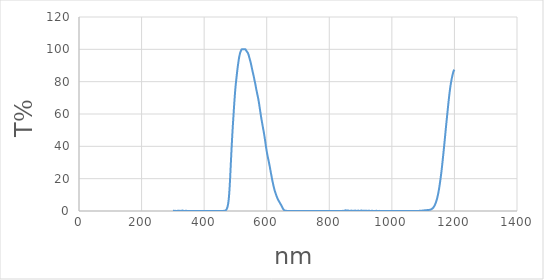
| Category | Series 0 |
|---|---|
| 1200.0 | 87.41 |
| 1199.0 | 87.18 |
| 1198.0 | 86.83 |
| 1197.0 | 86.35 |
| 1196.0 | 85.72 |
| 1195.0 | 84.98 |
| 1194.0 | 84.19 |
| 1193.0 | 83.32 |
| 1192.0 | 82.41 |
| 1191.0 | 81.44 |
| 1190.0 | 80.4 |
| 1189.0 | 79.31 |
| 1188.0 | 78.11 |
| 1187.0 | 76.83 |
| 1186.0 | 75.48 |
| 1185.0 | 73.97 |
| 1184.0 | 72.39 |
| 1183.0 | 70.72 |
| 1182.0 | 68.98 |
| 1181.0 | 67.16 |
| 1180.0 | 65.33 |
| 1179.0 | 63.46 |
| 1178.0 | 61.56 |
| 1177.0 | 59.67 |
| 1176.0 | 57.73 |
| 1175.0 | 55.84 |
| 1174.0 | 53.9 |
| 1173.0 | 51.95 |
| 1172.0 | 49.97 |
| 1171.0 | 47.94 |
| 1170.0 | 45.94 |
| 1169.0 | 43.89 |
| 1168.0 | 41.92 |
| 1167.0 | 39.94 |
| 1166.0 | 38 |
| 1165.0 | 36.1 |
| 1164.0 | 34.22 |
| 1163.0 | 32.36 |
| 1162.0 | 30.5 |
| 1161.0 | 28.7 |
| 1160.0 | 26.91 |
| 1159.0 | 25.21 |
| 1158.0 | 23.57 |
| 1157.0 | 22.03 |
| 1156.0 | 20.56 |
| 1155.0 | 19.11 |
| 1154.0 | 17.75 |
| 1153.0 | 16.43 |
| 1152.0 | 15.14 |
| 1151.0 | 13.91 |
| 1150.0 | 12.77 |
| 1149.0 | 11.68 |
| 1148.0 | 10.68 |
| 1147.0 | 9.76 |
| 1146.0 | 8.9 |
| 1145.0 | 8.07 |
| 1144.0 | 7.33 |
| 1143.0 | 6.65 |
| 1142.0 | 6.02 |
| 1141.0 | 5.43 |
| 1140.0 | 4.9 |
| 1139.0 | 4.42 |
| 1138.0 | 3.97 |
| 1137.0 | 3.56 |
| 1136.0 | 3.19 |
| 1135.0 | 2.84 |
| 1134.0 | 2.53 |
| 1133.0 | 2.25 |
| 1132.0 | 2.01 |
| 1131.0 | 1.79 |
| 1130.0 | 1.62 |
| 1129.0 | 1.46 |
| 1128.0 | 1.32 |
| 1127.0 | 1.2 |
| 1126.0 | 1.09 |
| 1125.0 | 1 |
| 1124.0 | 0.92 |
| 1123.0 | 0.86 |
| 1122.0 | 0.81 |
| 1121.0 | 0.75 |
| 1120.0 | 0.71 |
| 1119.0 | 0.68 |
| 1118.0 | 0.65 |
| 1117.0 | 0.63 |
| 1116.0 | 0.61 |
| 1115.0 | 0.61 |
| 1114.0 | 0.58 |
| 1113.0 | 0.56 |
| 1112.0 | 0.54 |
| 1111.0 | 0.52 |
| 1110.0 | 0.5 |
| 1109.0 | 0.5 |
| 1108.0 | 0.49 |
| 1107.0 | 0.46 |
| 1106.0 | 0.44 |
| 1105.0 | 0.42 |
| 1104.0 | 0.4 |
| 1103.0 | 0.37 |
| 1102.0 | 0.34 |
| 1101.0 | 0.33 |
| 1100.0 | 0.3 |
| 1099.0 | 0.27 |
| 1098.0 | 0.25 |
| 1097.0 | 0.23 |
| 1096.0 | 0.21 |
| 1095.0 | 0.21 |
| 1094.0 | 0.21 |
| 1093.0 | 0.19 |
| 1092.0 | 0.18 |
| 1091.0 | 0.17 |
| 1090.0 | 0.14 |
| 1089.0 | 0.11 |
| 1088.0 | 0.09 |
| 1087.0 | 0.07 |
| 1086.0 | 0.06 |
| 1085.0 | 0.05 |
| 1084.0 | 0.06 |
| 1083.0 | 0.07 |
| 1082.0 | 0.07 |
| 1081.0 | 0.06 |
| 1080.0 | 0.06 |
| 1079.0 | 0.05 |
| 1078.0 | 0.06 |
| 1077.0 | 0.05 |
| 1076.0 | 0.04 |
| 1075.0 | 0.03 |
| 1074.0 | 0.02 |
| 1073.0 | 0.02 |
| 1072.0 | 0.02 |
| 1071.0 | 0.02 |
| 1070.0 | 0.02 |
| 1069.0 | 0.02 |
| 1068.0 | 0.03 |
| 1067.0 | 0.03 |
| 1066.0 | 0.02 |
| 1065.0 | 0.01 |
| 1064.0 | 0.01 |
| 1063.0 | 0.03 |
| 1062.0 | 0.02 |
| 1061.0 | 0.02 |
| 1060.0 | 0.02 |
| 1059.0 | 0.03 |
| 1058.0 | 0.04 |
| 1057.0 | 0.05 |
| 1056.0 | 0.04 |
| 1055.0 | 0.04 |
| 1054.0 | 0.05 |
| 1053.0 | 0.05 |
| 1052.0 | 0.03 |
| 1051.0 | 0.03 |
| 1050.0 | 0.02 |
| 1049.0 | 0.02 |
| 1048.0 | 0.02 |
| 1047.0 | 0.02 |
| 1046.0 | 0.02 |
| 1045.0 | 0.03 |
| 1044.0 | 0.04 |
| 1043.0 | 0.05 |
| 1042.0 | 0.06 |
| 1041.0 | 0.06 |
| 1040.0 | 0.05 |
| 1039.0 | 0.03 |
| 1038.0 | 0.02 |
| 1037.0 | 0 |
| 1036.0 | 0.01 |
| 1035.0 | 0.02 |
| 1034.0 | 0 |
| 1033.0 | 0.04 |
| 1032.0 | 0.06 |
| 1031.0 | 0.06 |
| 1030.0 | 0.06 |
| 1029.0 | 0.03 |
| 1028.0 | 0.01 |
| 1027.0 | 0 |
| 1026.0 | 0.02 |
| 1025.0 | 0 |
| 1024.0 | 0.02 |
| 1023.0 | 0.05 |
| 1022.0 | 0.07 |
| 1021.0 | 0.06 |
| 1020.0 | 0.05 |
| 1019.0 | 0.03 |
| 1018.0 | 0.03 |
| 1017.0 | 0.01 |
| 1016.0 | 0.02 |
| 1015.0 | 0.02 |
| 1014.0 | 0.02 |
| 1013.0 | 0.04 |
| 1012.0 | 0.03 |
| 1011.0 | 0.04 |
| 1010.0 | 0 |
| 1009.0 | 0 |
| 1008.0 | 0.01 |
| 1007.0 | 0.01 |
| 1006.0 | 0.01 |
| 1005.0 | 0.01 |
| 1004.0 | 0.02 |
| 1003.0 | 0.01 |
| 1002.0 | 0 |
| 1001.0 | 0.01 |
| 1000.0 | 0 |
| 999.0 | 0.01 |
| 998.0 | 0.01 |
| 997.0 | 0.03 |
| 996.0 | 0.01 |
| 995.0 | 0.02 |
| 994.0 | 0.02 |
| 993.0 | 0 |
| 992.0 | 0.01 |
| 991.0 | 0.01 |
| 990.0 | 0.02 |
| 989.0 | 0.05 |
| 988.0 | 0.06 |
| 987.0 | 0.04 |
| 986.0 | 0 |
| 985.0 | 0 |
| 984.0 | 0.01 |
| 983.0 | 0.01 |
| 982.0 | 0.03 |
| 981.0 | 0.02 |
| 980.0 | 0.04 |
| 979.0 | 0.07 |
| 978.0 | 0.02 |
| 977.0 | 0.02 |
| 976.0 | 0.01 |
| 975.0 | 0.03 |
| 974.0 | 0.02 |
| 973.0 | 0 |
| 972.0 | 0.01 |
| 971.0 | 0.03 |
| 970.0 | 0.04 |
| 969.0 | 0.02 |
| 968.0 | 0.02 |
| 967.0 | 0.03 |
| 966.0 | 0.01 |
| 965.0 | 0.02 |
| 964.0 | 0.02 |
| 963.0 | 0.02 |
| 962.0 | 0.04 |
| 961.0 | 0.04 |
| 960.0 | 0.05 |
| 959.0 | 0.08 |
| 958.0 | 0.05 |
| 957.0 | 0.03 |
| 956.0 | 0.04 |
| 955.0 | 0.05 |
| 954.0 | 0.06 |
| 953.0 | 0.04 |
| 952.0 | 0.07 |
| 951.0 | 0.11 |
| 950.0 | 0.12 |
| 949.0 | 0.06 |
| 948.0 | 0.04 |
| 947.0 | 0.03 |
| 946.0 | 0.04 |
| 945.0 | 0.04 |
| 944.0 | 0 |
| 943.0 | 0.02 |
| 942.0 | 0.02 |
| 941.0 | 0.01 |
| 940.0 | 0.03 |
| 939.0 | 0.06 |
| 938.0 | 0.12 |
| 937.0 | 0.15 |
| 936.0 | 0.16 |
| 935.0 | 0.08 |
| 934.0 | 0.02 |
| 933.0 | 0.03 |
| 932.0 | 0.04 |
| 931.0 | 0.02 |
| 930.0 | 0.05 |
| 929.0 | 0.13 |
| 928.0 | 0.17 |
| 927.0 | 0.21 |
| 926.0 | 0.23 |
| 925.0 | 0.21 |
| 924.0 | 0.15 |
| 923.0 | 0.07 |
| 922.0 | 0.03 |
| 921.0 | 0.03 |
| 920.0 | 0.06 |
| 919.0 | 0.12 |
| 918.0 | 0.16 |
| 917.0 | 0.17 |
| 916.0 | 0.16 |
| 915.0 | 0.16 |
| 914.0 | 0.18 |
| 913.0 | 0.18 |
| 912.0 | 0.16 |
| 911.0 | 0.16 |
| 910.0 | 0.17 |
| 909.0 | 0.13 |
| 908.0 | 0.08 |
| 907.0 | 0.01 |
| 906.0 | 0.12 |
| 905.0 | 0.2 |
| 904.0 | 0.27 |
| 903.0 | 0.29 |
| 902.0 | 0.3 |
| 901.0 | 0.23 |
| 900.0 | 0.18 |
| 899.0 | 0.09 |
| 898.0 | 0.01 |
| 897.0 | 0.03 |
| 896.0 | 0 |
| 895.0 | 0.06 |
| 894.0 | 0.16 |
| 893.0 | 0.24 |
| 892.0 | 0.23 |
| 891.0 | 0.06 |
| 890.0 | 0.06 |
| 889.0 | 0.11 |
| 888.0 | 0.03 |
| 887.0 | 0.01 |
| 886.0 | 0.08 |
| 885.0 | 0.14 |
| 884.0 | 0.2 |
| 883.0 | 0.27 |
| 882.0 | 0.19 |
| 881.0 | 0.04 |
| 880.0 | 0.06 |
| 879.0 | 0.16 |
| 878.0 | 0.17 |
| 877.0 | 0.03 |
| 876.0 | 0.03 |
| 875.0 | 0.06 |
| 874.0 | 0.11 |
| 873.0 | 0.07 |
| 872.0 | 0.07 |
| 871.0 | 0.21 |
| 870.0 | 0.28 |
| 869.0 | 0.21 |
| 868.0 | 0.09 |
| 867.0 | 0 |
| 866.0 | 0.06 |
| 865.0 | 0.09 |
| 864.0 | 0.04 |
| 863.0 | 0.04 |
| 862.0 | 0.02 |
| 861.0 | 0.23 |
| 860.0 | 0.37 |
| 859.0 | 0.31 |
| 858.0 | 0.12 |
| 857.0 | 0.33 |
| 856.0 | 0.3 |
| 855.0 | 0.22 |
| 854.0 | 0.26 |
| 853.0 | 0.39 |
| 852.0 | 0.42 |
| 851.0 | 0.33 |
| 850.0 | 0.28 |
| 849.0 | 0.22 |
| 848.0 | 0.1 |
| 847.0 | 0.01 |
| 846.0 | 0.02 |
| 845.0 | 0.03 |
| 844.0 | 0.14 |
| 843.0 | 0.02 |
| 842.0 | 0.04 |
| 841.0 | 0.03 |
| 840.0 | 0.02 |
| 839.0 | 0.01 |
| 838.0 | 0.01 |
| 837.0 | 0.01 |
| 836.0 | 0.01 |
| 835.0 | 0 |
| 834.0 | 0 |
| 833.0 | 0 |
| 832.0 | 0 |
| 831.0 | 0 |
| 830.0 | 0 |
| 829.0 | 0 |
| 828.0 | 0 |
| 827.0 | 0 |
| 826.0 | 0 |
| 825.0 | 0 |
| 824.0 | 0.01 |
| 823.0 | 0.01 |
| 822.0 | 0.01 |
| 821.0 | 0.01 |
| 820.0 | 0.01 |
| 819.0 | 0.01 |
| 818.0 | 0.01 |
| 817.0 | 0.01 |
| 816.0 | 0.01 |
| 815.0 | 0.01 |
| 814.0 | 0.02 |
| 813.0 | 0.01 |
| 812.0 | 0.01 |
| 811.0 | 0.01 |
| 810.0 | 0.01 |
| 809.0 | 0.01 |
| 808.0 | 0.02 |
| 807.0 | 0.02 |
| 806.0 | 0.02 |
| 805.0 | 0.02 |
| 804.0 | 0.02 |
| 803.0 | 0.02 |
| 802.0 | 0.02 |
| 801.0 | 0.02 |
| 800.0 | 0.02 |
| 799.0 | 0.02 |
| 798.0 | 0.02 |
| 797.0 | 0.02 |
| 796.0 | 0.02 |
| 795.0 | 0.01 |
| 794.0 | 0.01 |
| 793.0 | 0.02 |
| 792.0 | 0.01 |
| 791.0 | 0.01 |
| 790.0 | 0.01 |
| 789.0 | 0.01 |
| 788.0 | 0.01 |
| 787.0 | 0.01 |
| 786.0 | 0 |
| 785.0 | 0 |
| 784.0 | 0 |
| 783.0 | 0 |
| 782.0 | 0 |
| 781.0 | 0 |
| 780.0 | 0 |
| 779.0 | 0.01 |
| 778.0 | 0.01 |
| 777.0 | 0.01 |
| 776.0 | 0.01 |
| 775.0 | 0.01 |
| 774.0 | 0.01 |
| 773.0 | 0.01 |
| 772.0 | 0 |
| 771.0 | 0.01 |
| 770.0 | 0.01 |
| 769.0 | 0.01 |
| 768.0 | 0.01 |
| 767.0 | 0.01 |
| 766.0 | 0.01 |
| 765.0 | 0.01 |
| 764.0 | 0.01 |
| 763.0 | 0 |
| 762.0 | 0 |
| 761.0 | 0.01 |
| 760.0 | 0.01 |
| 759.0 | 0.01 |
| 758.0 | 0.01 |
| 757.0 | 0.01 |
| 756.0 | 0.01 |
| 755.0 | 0.01 |
| 754.0 | 0.01 |
| 753.0 | 0.01 |
| 752.0 | 0.01 |
| 751.0 | 0.01 |
| 750.0 | 0.01 |
| 749.0 | 0.01 |
| 748.0 | 0 |
| 747.0 | 0 |
| 746.0 | 0.01 |
| 745.0 | 0.01 |
| 744.0 | 0.01 |
| 743.0 | 0.01 |
| 742.0 | 0.01 |
| 741.0 | 0.01 |
| 740.0 | 0.01 |
| 739.0 | 0.02 |
| 738.0 | 0.02 |
| 737.0 | 0.02 |
| 736.0 | 0.02 |
| 735.0 | 0.02 |
| 734.0 | 0.01 |
| 733.0 | 0.01 |
| 732.0 | 0.01 |
| 731.0 | 0.01 |
| 730.0 | 0.01 |
| 729.0 | 0.01 |
| 728.0 | 0.01 |
| 727.0 | 0.01 |
| 726.0 | 0.01 |
| 725.0 | 0.01 |
| 724.0 | 0.01 |
| 723.0 | 0.01 |
| 722.0 | 0.01 |
| 721.0 | 0.01 |
| 720.0 | 0.01 |
| 719.0 | 0.01 |
| 718.0 | 0.01 |
| 717.0 | 0.01 |
| 716.0 | 0.01 |
| 715.0 | 0.01 |
| 714.0 | 0.01 |
| 713.0 | 0.01 |
| 712.0 | 0.01 |
| 711.0 | 0.01 |
| 710.0 | 0.01 |
| 709.0 | 0.01 |
| 708.0 | 0.01 |
| 707.0 | 0.01 |
| 706.0 | 0.01 |
| 705.0 | 0.01 |
| 704.0 | 0.01 |
| 703.0 | 0.01 |
| 702.0 | 0.01 |
| 701.0 | 0.01 |
| 700.0 | 0.01 |
| 699.0 | 0.01 |
| 698.0 | 0.01 |
| 697.0 | 0.01 |
| 696.0 | 0.01 |
| 695.0 | 0.01 |
| 694.0 | 0.01 |
| 693.0 | 0.01 |
| 692.0 | 0.01 |
| 691.0 | 0.01 |
| 690.0 | 0.01 |
| 689.0 | 0.01 |
| 688.0 | 0.01 |
| 687.0 | 0.01 |
| 686.0 | 0.01 |
| 685.0 | 0.01 |
| 684.0 | 0.01 |
| 683.0 | 0.01 |
| 682.0 | 0.01 |
| 681.0 | 0.01 |
| 680.0 | 0.01 |
| 679.0 | 0.01 |
| 678.0 | 0.01 |
| 677.0 | 0 |
| 676.0 | 0 |
| 675.0 | 0 |
| 674.0 | 0 |
| 673.0 | 0 |
| 672.0 | 0.01 |
| 671.0 | 0.01 |
| 670.0 | 0.02 |
| 669.0 | 0.02 |
| 668.0 | 0.03 |
| 667.0 | 0.04 |
| 666.0 | 0.05 |
| 665.0 | 0.07 |
| 664.0 | 0.08 |
| 663.0 | 0.1 |
| 662.0 | 0.12 |
| 661.0 | 0.15 |
| 660.0 | 0.18 |
| 659.0 | 0.23 |
| 658.0 | 0.29 |
| 657.0 | 0.39 |
| 656.0 | 0.52 |
| 655.0 | 0.69 |
| 654.0 | 0.9 |
| 653.0 | 1.15 |
| 652.0 | 1.45 |
| 651.0 | 1.79 |
| 650.0 | 2.15 |
| 649.0 | 2.53 |
| 648.0 | 2.91 |
| 647.0 | 3.29 |
| 646.0 | 3.68 |
| 645.0 | 4.04 |
| 644.0 | 4.39 |
| 643.0 | 4.74 |
| 642.0 | 5.08 |
| 641.0 | 5.4 |
| 640.0 | 5.73 |
| 639.0 | 6.07 |
| 638.0 | 6.4 |
| 637.0 | 6.75 |
| 636.0 | 7.14 |
| 635.0 | 7.56 |
| 634.0 | 7.99 |
| 633.0 | 8.45 |
| 632.0 | 8.97 |
| 631.0 | 9.49 |
| 630.0 | 10.04 |
| 629.0 | 10.57 |
| 628.0 | 11.13 |
| 627.0 | 11.72 |
| 626.0 | 12.34 |
| 625.0 | 13.01 |
| 624.0 | 13.73 |
| 623.0 | 14.47 |
| 622.0 | 15.3 |
| 621.0 | 16.16 |
| 620.0 | 17.07 |
| 619.0 | 17.98 |
| 618.0 | 18.93 |
| 617.0 | 19.9 |
| 616.0 | 20.91 |
| 615.0 | 21.92 |
| 614.0 | 22.93 |
| 613.0 | 23.98 |
| 612.0 | 25.08 |
| 611.0 | 26.15 |
| 610.0 | 27.2 |
| 609.0 | 28.2 |
| 608.0 | 29.17 |
| 607.0 | 30.11 |
| 606.0 | 31.11 |
| 605.0 | 32 |
| 604.0 | 32.91 |
| 603.0 | 33.8 |
| 602.0 | 34.79 |
| 601.0 | 35.85 |
| 600.0 | 36.94 |
| 599.0 | 38.09 |
| 598.0 | 39.35 |
| 597.0 | 40.68 |
| 596.0 | 42.04 |
| 595.0 | 43.44 |
| 594.0 | 44.73 |
| 593.0 | 45.96 |
| 592.0 | 47.16 |
| 591.0 | 48.36 |
| 590.0 | 49.5 |
| 589.0 | 50.5 |
| 588.0 | 51.57 |
| 587.0 | 52.66 |
| 586.0 | 53.76 |
| 585.0 | 54.87 |
| 584.0 | 55.96 |
| 583.0 | 57.11 |
| 582.0 | 58.28 |
| 581.0 | 59.49 |
| 580.0 | 60.79 |
| 579.0 | 62.11 |
| 578.0 | 63.33 |
| 577.0 | 64.63 |
| 576.0 | 65.93 |
| 575.0 | 67.09 |
| 574.0 | 68.34 |
| 573.0 | 69.38 |
| 572.0 | 70.34 |
| 571.0 | 71.27 |
| 570.0 | 72.16 |
| 569.0 | 73.13 |
| 568.0 | 74.1 |
| 567.0 | 74.96 |
| 566.0 | 75.97 |
| 565.0 | 77.06 |
| 564.0 | 78.06 |
| 563.0 | 79.06 |
| 562.0 | 79.97 |
| 561.0 | 80.88 |
| 560.0 | 81.88 |
| 559.0 | 82.83 |
| 558.0 | 83.7 |
| 557.0 | 84.58 |
| 556.0 | 85.36 |
| 555.0 | 86.23 |
| 554.0 | 87.14 |
| 553.0 | 88.01 |
| 552.0 | 88.94 |
| 551.0 | 89.86 |
| 550.0 | 90.71 |
| 549.0 | 91.62 |
| 548.0 | 92.4 |
| 547.0 | 93.08 |
| 546.0 | 93.73 |
| 545.0 | 94.47 |
| 544.0 | 95.18 |
| 543.0 | 95.96 |
| 542.0 | 96.61 |
| 541.0 | 97.14 |
| 540.0 | 97.6 |
| 539.0 | 97.95 |
| 538.0 | 98.3 |
| 537.0 | 98.52 |
| 536.0 | 98.7 |
| 535.0 | 99.11 |
| 534.0 | 99.44 |
| 533.0 | 99.73 |
| 532.0 | 100 |
| 531.0 | 100 |
| 530.0 | 100 |
| 529.0 | 100 |
| 528.0 | 100 |
| 527.0 | 100 |
| 526.0 | 100 |
| 525.0 | 100 |
| 524.0 | 100 |
| 523.0 | 100 |
| 522.0 | 100 |
| 521.0 | 100 |
| 520.0 | 100 |
| 519.0 | 99.75 |
| 518.0 | 99.27 |
| 517.0 | 98.82 |
| 516.0 | 98.38 |
| 515.0 | 97.78 |
| 514.0 | 97.03 |
| 513.0 | 96.11 |
| 512.0 | 95.21 |
| 511.0 | 94.1 |
| 510.0 | 92.8 |
| 509.0 | 91.43 |
| 508.0 | 90.12 |
| 507.0 | 88.6 |
| 506.0 | 87.02 |
| 505.0 | 85.34 |
| 504.0 | 83.54 |
| 503.0 | 81.83 |
| 502.0 | 80.07 |
| 501.0 | 78.16 |
| 500.0 | 76.11 |
| 499.0 | 73.82 |
| 498.0 | 71.29 |
| 497.0 | 68.58 |
| 496.0 | 65.68 |
| 495.0 | 62.73 |
| 494.0 | 59.74 |
| 493.0 | 56.65 |
| 492.0 | 53.63 |
| 491.0 | 50.41 |
| 490.0 | 47.06 |
| 489.0 | 43.58 |
| 488.0 | 39.89 |
| 487.0 | 36.08 |
| 486.0 | 32.11 |
| 485.0 | 28.12 |
| 484.0 | 24.07 |
| 483.0 | 20.15 |
| 482.0 | 16.49 |
| 481.0 | 13.24 |
| 480.0 | 10.43 |
| 479.0 | 8.09 |
| 478.0 | 6.27 |
| 477.0 | 4.81 |
| 476.0 | 3.7 |
| 475.0 | 2.83 |
| 474.0 | 2.15 |
| 473.0 | 1.62 |
| 472.0 | 1.19 |
| 471.0 | 0.87 |
| 470.0 | 0.62 |
| 469.0 | 0.45 |
| 468.0 | 0.32 |
| 467.0 | 0.23 |
| 466.0 | 0.17 |
| 465.0 | 0.13 |
| 464.0 | 0.11 |
| 463.0 | 0.09 |
| 462.0 | 0.08 |
| 461.0 | 0.07 |
| 460.0 | 0.06 |
| 459.0 | 0.05 |
| 458.0 | 0.04 |
| 457.0 | 0.04 |
| 456.0 | 0.03 |
| 455.0 | 0.03 |
| 454.0 | 0.03 |
| 453.0 | 0.03 |
| 452.0 | 0.02 |
| 451.0 | 0.02 |
| 450.0 | 0.02 |
| 449.0 | 0.02 |
| 448.0 | 0.02 |
| 447.0 | 0.01 |
| 446.0 | 0.01 |
| 445.0 | 0.01 |
| 444.0 | 0.01 |
| 443.0 | 0.01 |
| 442.0 | 0.01 |
| 441.0 | 0.01 |
| 440.0 | 0.01 |
| 439.0 | 0.02 |
| 438.0 | 0.02 |
| 437.0 | 0.02 |
| 436.0 | 0.02 |
| 435.0 | 0.01 |
| 434.0 | 0.01 |
| 433.0 | 0.01 |
| 432.0 | 0.01 |
| 431.0 | 0.02 |
| 430.0 | 0.02 |
| 429.0 | 0.02 |
| 428.0 | 0.03 |
| 427.0 | 0.02 |
| 426.0 | 0.02 |
| 425.0 | 0.01 |
| 424.0 | 0.01 |
| 423.0 | 0.01 |
| 422.0 | 0.01 |
| 421.0 | 0.01 |
| 420.0 | 0.01 |
| 419.0 | 0.01 |
| 418.0 | 0.01 |
| 417.0 | 0.02 |
| 416.0 | 0.02 |
| 415.0 | 0.01 |
| 414.0 | 0.01 |
| 413.0 | 0.01 |
| 412.0 | 0.01 |
| 411.0 | 0.01 |
| 410.0 | 0.02 |
| 409.0 | 0.02 |
| 408.0 | 0.02 |
| 407.0 | 0.02 |
| 406.0 | 0.02 |
| 405.0 | 0.02 |
| 404.0 | 0.01 |
| 403.0 | 0.02 |
| 402.0 | 0.01 |
| 401.0 | 0.02 |
| 400.0 | 0.02 |
| 399.0 | 0.03 |
| 398.0 | 0.03 |
| 397.0 | 0.03 |
| 396.0 | 0.02 |
| 395.0 | 0.02 |
| 394.0 | 0.02 |
| 393.0 | 0.02 |
| 392.0 | 0.02 |
| 391.0 | 0.02 |
| 390.0 | 0.02 |
| 389.0 | 0.02 |
| 388.0 | 0.01 |
| 387.0 | 0.02 |
| 386.0 | 0.02 |
| 385.0 | 0.02 |
| 384.0 | 0.03 |
| 383.0 | 0.03 |
| 382.0 | 0.02 |
| 381.0 | 0.03 |
| 380.0 | 0.03 |
| 379.0 | 0.02 |
| 378.0 | 0.02 |
| 377.0 | 0.03 |
| 376.0 | 0.02 |
| 375.0 | 0.03 |
| 374.0 | 0.03 |
| 373.0 | 0.02 |
| 372.0 | 0.02 |
| 371.0 | 0.02 |
| 370.0 | 0.02 |
| 369.0 | 0.02 |
| 368.0 | 0.02 |
| 367.0 | 0.02 |
| 366.0 | 0.02 |
| 365.0 | 0.02 |
| 364.0 | 0.02 |
| 363.0 | 0.02 |
| 362.0 | 0.02 |
| 361.0 | 0.03 |
| 360.0 | 0.03 |
| 359.0 | 0.04 |
| 358.0 | 0.03 |
| 357.0 | 0.03 |
| 356.0 | 0.02 |
| 355.0 | 0.01 |
| 354.0 | 0.02 |
| 353.0 | 0.03 |
| 352.0 | 0.03 |
| 351.0 | 0.04 |
| 350.0 | 0.06 |
| 349.0 | 0.05 |
| 348.0 | 0.05 |
| 347.0 | 0.05 |
| 346.0 | 0.02 |
| 345.0 | 0.06 |
| 344.0 | 0.1 |
| 343.0 | 0.08 |
| 342.0 | 0.01 |
| 341.0 | 0.05 |
| 340.0 | 0.1 |
| 339.0 | 0.06 |
| 338.0 | 0 |
| 337.0 | 0.02 |
| 336.0 | 0.02 |
| 335.0 | 0.01 |
| 334.0 | 0.11 |
| 333.0 | 0.05 |
| 332.0 | 0.21 |
| 331.0 | 0.26 |
| 330.0 | 0.13 |
| 329.0 | 0.16 |
| 328.0 | 0.18 |
| 327.0 | 0.17 |
| 326.0 | 0.13 |
| 325.0 | 0.1 |
| 324.0 | 0.03 |
| 323.0 | 0 |
| 322.0 | 0.08 |
| 321.0 | 0.08 |
| 320.0 | 0.15 |
| 319.0 | 0.04 |
| 318.0 | 0.21 |
| 317.0 | 0.11 |
| 316.0 | 0.04 |
| 315.0 | 0.09 |
| 314.0 | 0.06 |
| 313.0 | 0.04 |
| 312.0 | 0.04 |
| 311.0 | 0.04 |
| 310.0 | 0.03 |
| 309.0 | 0 |
| 308.0 | 0.02 |
| 307.0 | 0.13 |
| 306.0 | 0.09 |
| 305.0 | 0.03 |
| 304.0 | 0.05 |
| 303.0 | 0.1 |
| 302.0 | 0.09 |
| 301.0 | 0.13 |
| 300.0 | 0.18 |